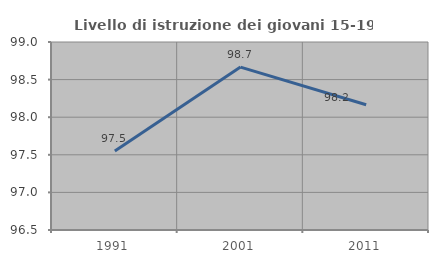
| Category | Livello di istruzione dei giovani 15-19 anni |
|---|---|
| 1991.0 | 97.549 |
| 2001.0 | 98.667 |
| 2011.0 | 98.165 |